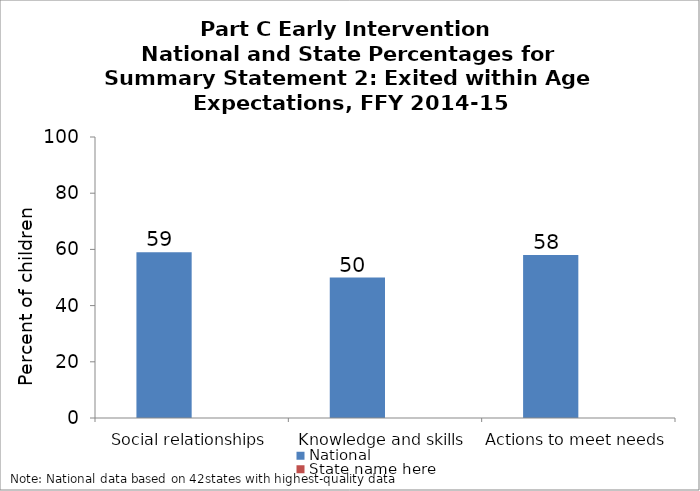
| Category | National | State name here |
|---|---|---|
| Social relationships | 59 |  |
| Knowledge and skills | 50 |  |
| Actions to meet needs | 58 |  |